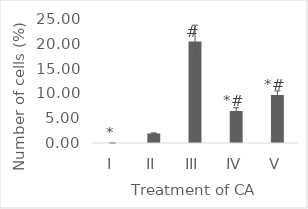
| Category | Series 0 |
|---|---|
| I | 0 |
| II | 1.927 |
| III | 20.443 |
| IV | 6.453 |
| V | 9.673 |